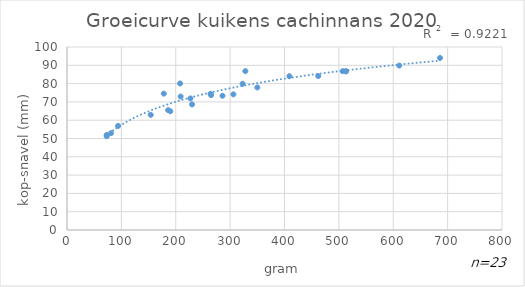
| Category | Head-bill length (100 mm) |
|---|---|
| 323.0 | 79.9 |
| 190.0 | 64.9 |
| 208.0 | 80.07 |
| 178.0 | 74.52 |
| 186.0 | 65.49 |
| 265.0 | 73.7 |
| 230.0 | 68.63 |
| 264.0 | 74.44 |
| 286.0 | 73.36 |
| 328.0 | 86.83 |
| 462.0 | 84.11 |
| 409.0 | 84.03 |
| 73.0 | 51.94 |
| 154.0 | 62.92 |
| 513.0 | 86.64 |
| 611.0 | 89.84 |
| 686.0 | 94 |
| 513.0 | 86.85 |
| 507.0 | 86.79 |
| 306.0 | 74.12 |
| 81.0 | 52.91 |
| 94.0 | 56.88 |
| 350.0 | 77.9 |
| 209.0 | 72.93 |
| 73.0 | 51.25 |
| 227.0 | 71.9 |